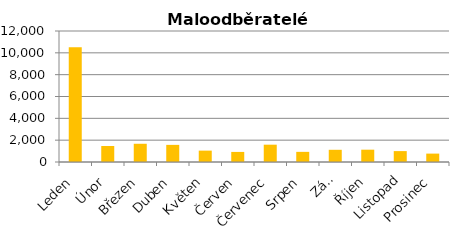
| Category | MO |
|---|---|
| Leden | 10508 |
| Únor | 1464 |
| Březen | 1670 |
| Duben | 1569 |
| Květen | 1042 |
| Červen | 923 |
| Červenec | 1586 |
| Srpen | 929 |
| Září | 1118 |
| Říjen | 1128 |
| Listopad | 998 |
| Prosinec | 769 |